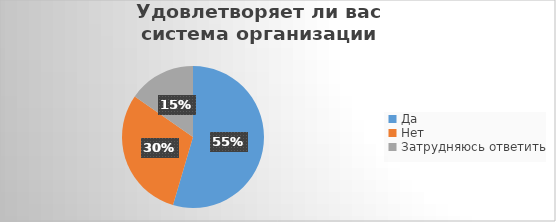
| Category | Series 0 |
|---|---|
| Да | 114 |
| Нет | 63 |
| Затрудняюсь ответить | 32 |